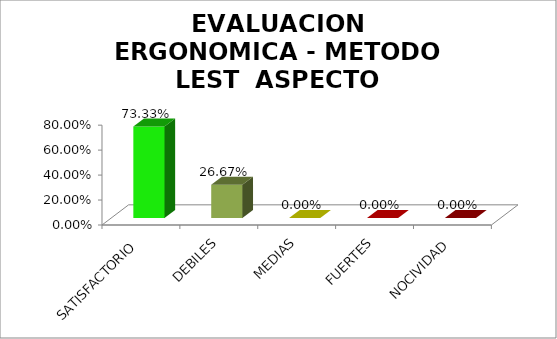
| Category | EVALUACION ERGONOMICA - METODO LEST  |
|---|---|
| SATISFACTORIO | 0.733 |
| DEBILES | 0.267 |
| MEDIAS | 0 |
| FUERTES | 0 |
| NOCIVIDAD | 0 |